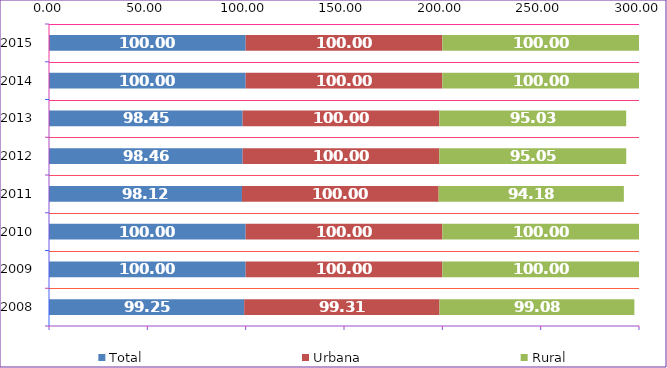
| Category | Total | Urbana | Rural |
|---|---|---|---|
| 2008.0 | 99.25 | 99.31 | 99.08 |
| 2009.0 | 100 | 100 | 100 |
| 2010.0 | 100 | 100 | 100 |
| 2011.0 | 98.12 | 100 | 94.18 |
| 2012.0 | 98.46 | 100 | 95.05 |
| 2013.0 | 98.45 | 100 | 95.03 |
| 2014.0 | 100 | 100 | 100 |
| 2015.0 | 100 | 100 | 100 |